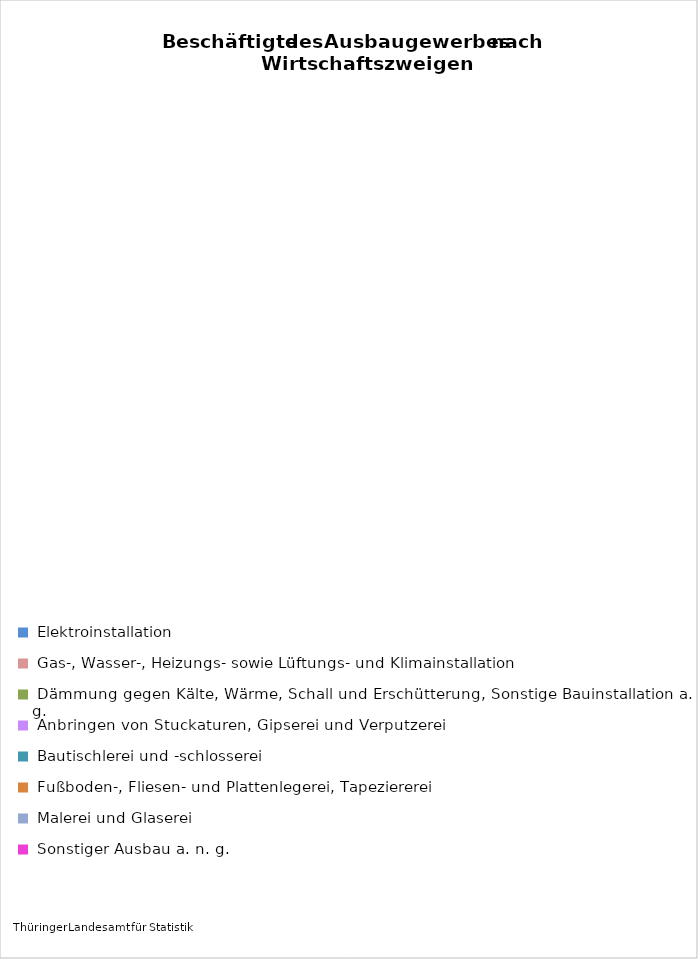
| Category | Anzahl Beschäftigte 2019 |
|---|---|
| Elektroinstallation | 5943 |
| Gas-, Wasser-, Heizungs- sowie Lüftungs- und Klimainstallation | 4360 |
| Dämmung gegen Kälte, Wärme, Schall und Erschütterung, Sonstige Bauinstallation a. n. g. | 798 |
| Anbringen von Stuckaturen, Gipserei und Verputzerei | 275 |
| Bautischlerei und -schlosserei | 988 |
| Fußboden-, Fliesen- und Plattenlegerei, Tapeziererei | 901 |
| Malerei und Glaserei | 1851 |
| Sonstiger Ausbau a. n. g. | 222 |